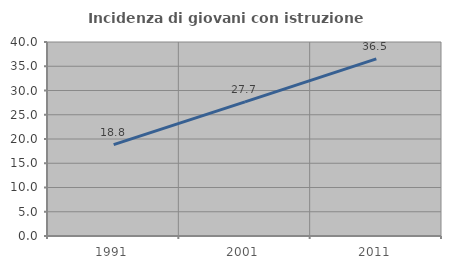
| Category | Incidenza di giovani con istruzione universitaria |
|---|---|
| 1991.0 | 18.826 |
| 2001.0 | 27.659 |
| 2011.0 | 36.518 |